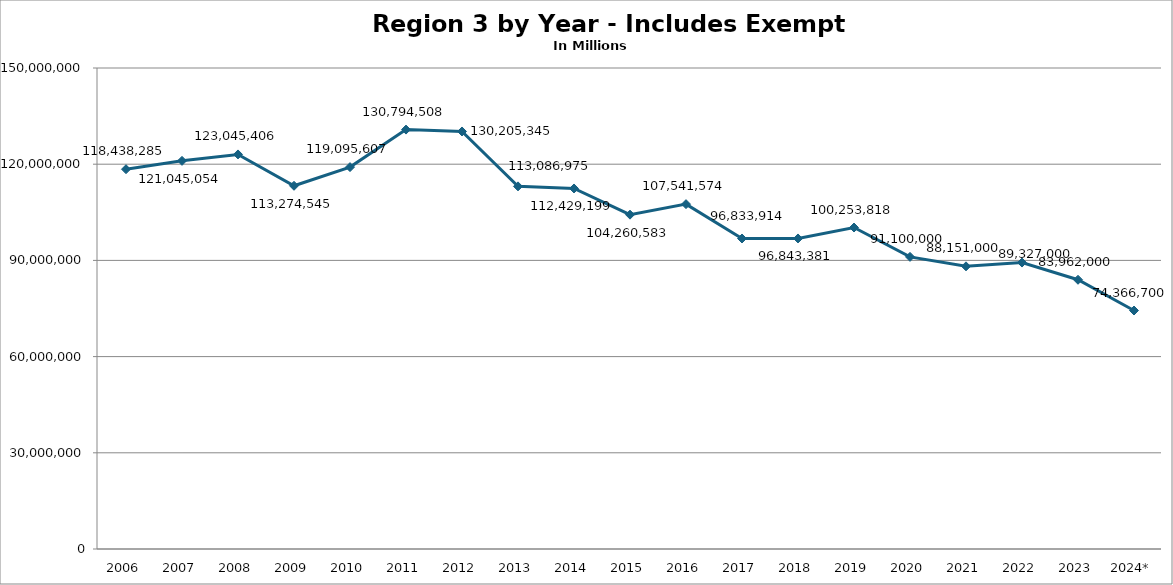
| Category | Series 0 |
|---|---|
| 2006 | 118438285.287 |
| 2007 | 121045053.81 |
| 2008 | 123045406.11 |
| 2009 | 113274544.54 |
| 2010 | 119095606.75 |
| 2011 | 130794507.5 |
| 2012 | 130205345 |
| 2013 | 113086975 |
| 2014 | 112429199 |
| 2015 | 104260583 |
| 2016 | 107541574 |
| 2017 | 96833914 |
| 2018 | 96843381 |
| 2019 | 100253818 |
| 2020 | 91100000 |
| 2021 | 88151000 |
| 2022 | 89327000 |
| 2023 | 83962000 |
| 2024* | 74366700 |